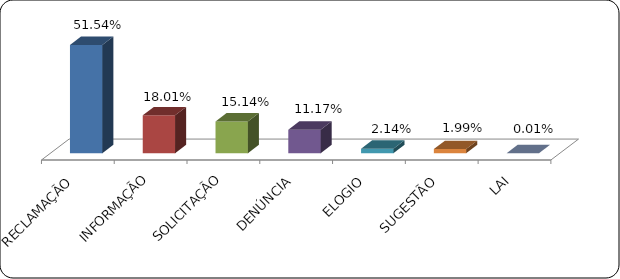
| Category | Series 0 |
|---|---|
|      RECLAMAÇÃO | 0.515 |
|      INFORMAÇÃO | 0.18 |
|      SOLICITAÇÃO | 0.151 |
|      DENÚNCIA | 0.112 |
|      ELOGIO | 0.021 |
|      SUGESTÃO | 0.02 |
|      LAI | 0 |